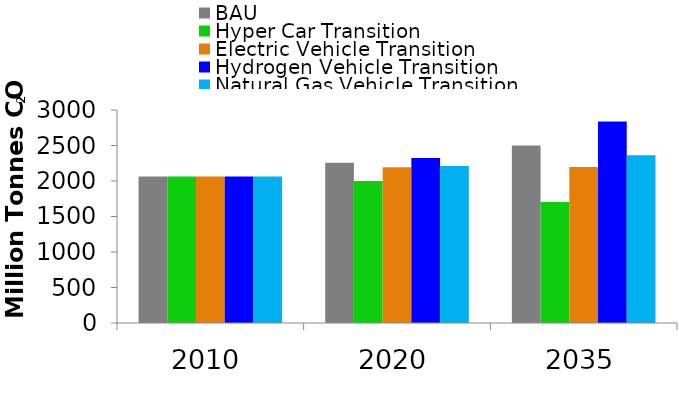
| Category | BAU | Hyper Car Transition | Electric Vehicle Transition | Hydrogen Vehicle Transition | Natural Gas Vehicle Transition |
|---|---|---|---|---|---|
| 2010.0 | 2061.939 | 2064.747 | 2064.692 | 2064.691 | 2064.691 |
| 2020.0 | 2255.547 | 1999.481 | 2195.271 | 2323.866 | 2212.666 |
| 2035.0 | 2498.912 | 1705.145 | 2197.845 | 2838.645 | 2361.533 |